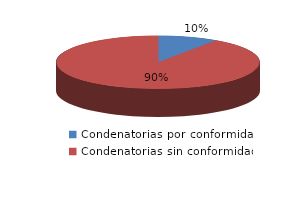
| Category | Series 0 |
|---|---|
| 0 | 2 |
| 1 | 19 |